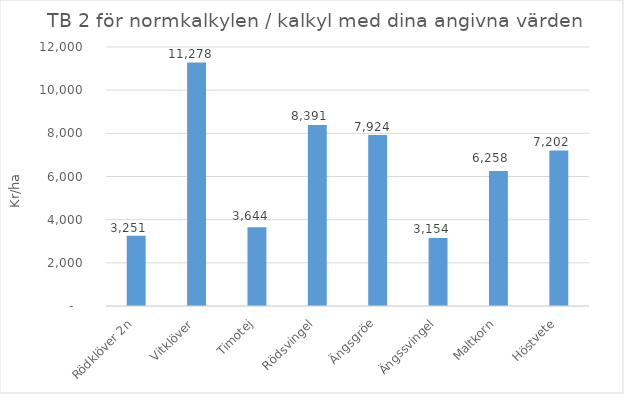
| Category | TB 2 vid normal skördenivå alternativt TB 2 för grödor där egna värden angivits |
|---|---|
| Rödklöver 2n | 3251.007 |
| Vitklöver | 11278.153 |
| Timotej | 3644.325 |
| Rödsvingel | 8391.147 |
| Ängsgröe | 7924.433 |
| Ängssvingel | 3154.3 |
| Maltkorn | 6257.997 |
| Höstvete | 7201.982 |